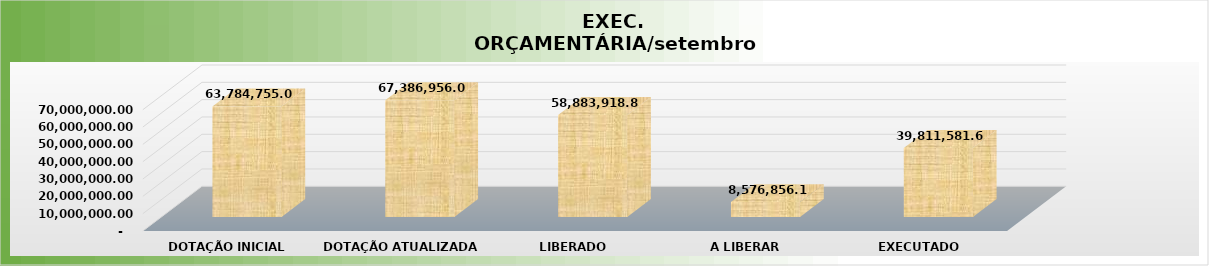
| Category | Series 0 |
|---|---|
| 0 | 63784755 |
| 1 | 67386956.09 |
| 2 | 58883918.82 |
| 3 | 8576856.19 |
| 4 | 39811581.65 |